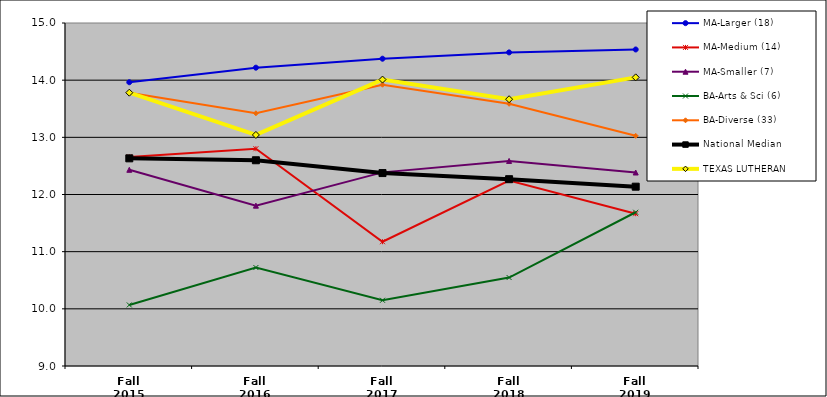
| Category | MA-Larger (18) | MA-Medium (14) | MA-Smaller (7) | BA-Arts & Sci (6) | BA-Diverse (33) | National Median | TEXAS LUTHERAN |
|---|---|---|---|---|---|---|---|
| Fall 2015 | 13.964 | 12.658 | 12.432 | 10.068 | 13.781 | 12.633 | 13.781 |
| Fall 2016 | 14.218 | 12.801 | 11.805 | 10.723 | 13.42 | 12.599 | 13.042 |
| Fall 2017 | 14.375 | 11.174 | 12.387 | 10.15 | 13.92 | 12.375 | 14.01 |
| Fall 2018 | 14.486 | 12.245 | 12.587 | 10.548 | 13.587 | 12.268 | 13.667 |
| Fall 2019 | 14.537 | 11.664 | 12.385 | 11.689 | 13.026 | 12.137 | 14.049 |